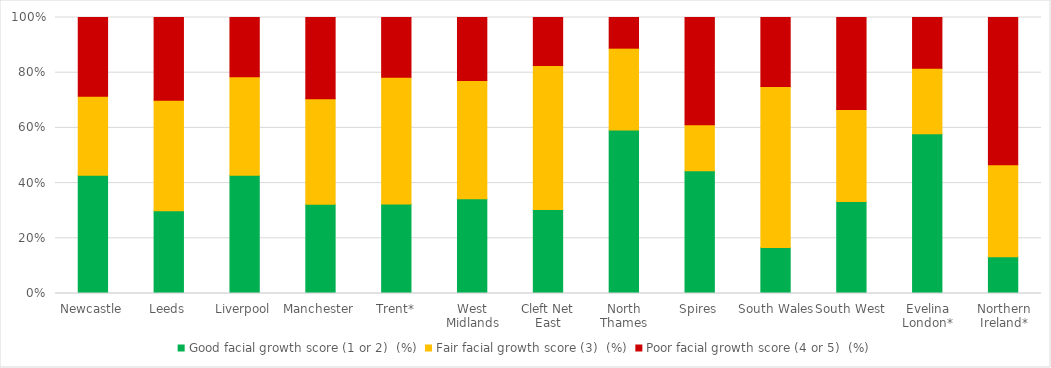
| Category | Good facial growth score (1 or 2) | Fair facial growth score (3) | Poor facial growth score (4 or 5) |
|---|---|---|---|
| Newcastle | 0.429 | 0.286 | 0.286 |
| Leeds | 0.3 | 0.4 | 0.3 |
| Liverpool | 0.429 | 0.357 | 0.214 |
| Manchester | 0.324 | 0.382 | 0.294 |
| Trent* | 0.324 | 0.459 | 0.216 |
| West Midlands | 0.343 | 0.429 | 0.229 |
| Cleft Net East | 0.304 | 0.522 | 0.174 |
| North Thames | 0.593 | 0.296 | 0.111 |
| Spires | 0.444 | 0.167 | 0.389 |
| South Wales | 0.167 | 0.583 | 0.25 |
| South West | 0.333 | 0.333 | 0.333 |
| Evelina London* | 0.579 | 0.237 | 0.184 |
| Northern Ireland* | 0.133 | 0.333 | 0.533 |